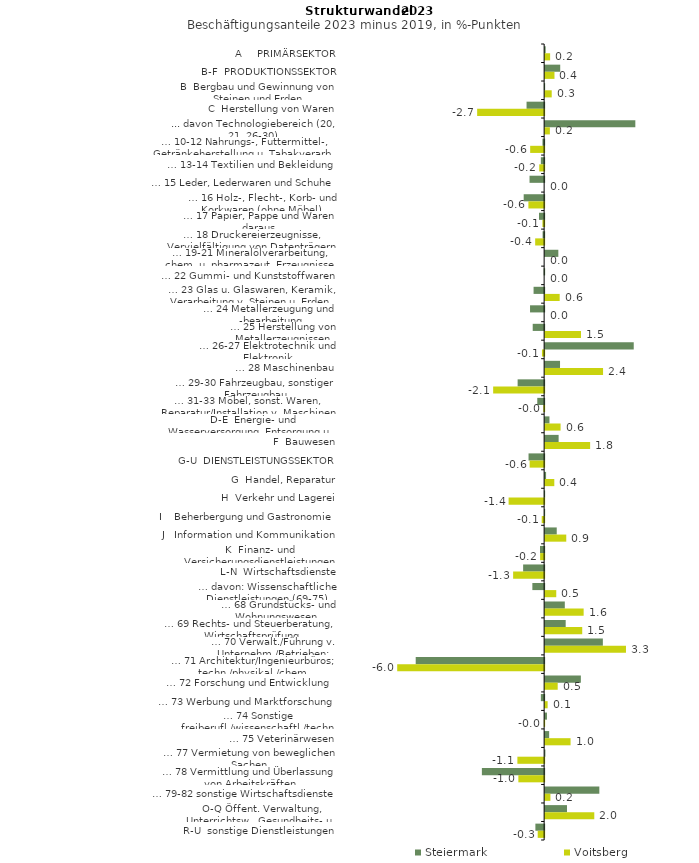
| Category | Steiermark | Voitsberg |
|---|---|---|
| A     PRIMÄRSEKTOR | 0.022 | 0.202 |
| B-F  PRODUKTIONSSEKTOR | 0.612 | 0.379 |
| B  Bergbau und Gewinnung von Steinen und Erden | -0.009 | 0.267 |
| C  Herstellung von Waren | -0.714 | -2.718 |
| ... davon Technologiebereich (20, 21, 26-30) | 3.66 | 0.192 |
| … 10-12 Nahrungs-, Futtermittel-, Getränkeherstellung u. Tabakverarb. | -0.068 | -0.567 |
| … 13-14 Textilien und Bekleidung | -0.134 | -0.199 |
| … 15 Leder, Lederwaren und Schuhe | -0.593 | 0 |
| … 16 Holz-, Flecht-, Korb- und Korkwaren (ohne Möbel)  | -0.83 | -0.639 |
| … 17 Papier, Pappe und Waren daraus  | -0.208 | -0.07 |
| … 18 Druckereierzeugnisse, Vervielfältigung von Datenträgern | -0.063 | -0.364 |
| … 19-21 Mineralölverarbeitung, chem. u. pharmazeut. Erzeugnisse | 0.535 | 0 |
| … 22 Gummi- und Kunststoffwaren | -0.02 | 0 |
| … 23 Glas u. Glaswaren, Keramik, Verarbeitung v. Steinen u. Erden  | -0.429 | 0.59 |
| … 24 Metallerzeugung und -bearbeitung | -0.572 | 0 |
| … 25 Herstellung von Metallerzeugnissen  | -0.464 | 1.455 |
| … 26-27 Elektrotechnik und Elektronik | 3.595 | -0.089 |
| … 28 Maschinenbau | 0.604 | 2.35 |
| … 29-30 Fahrzeugbau, sonstiger Fahrzeugbau | -1.076 | -2.069 |
| … 31-33 Möbel, sonst. Waren, Reparatur/Installation v. Maschinen | -0.279 | -0.034 |
| D-E  Energie- und Wasserversorgung, Entsorgung u. Rückgewinnung | 0.175 | 0.626 |
| F  Bauwesen | 0.547 | 1.825 |
| G-U  DIENSTLEISTUNGSSEKTOR | -0.633 | -0.588 |
| G  Handel, Reparatur | 0.038 | 0.372 |
| H  Verkehr und Lagerei | -0.011 | -1.442 |
| I    Beherbergung und Gastronomie | -0.007 | -0.098 |
| J   Information und Kommunikation | 0.471 | 0.857 |
| K  Finanz- und Versicherungsdienstleistungen | -0.168 | -0.163 |
| L-N  Wirtschaftsdienste | -0.853 | -1.258 |
| … davon: Wissenschaftliche Dienstleistungen (69-75) | -0.478 | 0.451 |
| … 68 Grundstücks- und Wohnungswesen  | 0.798 | 1.562 |
| … 69 Rechts- und Steuerberatung, Wirtschaftsprüfung | 0.834 | 1.505 |
| … 70 Verwalt./Führung v. Unternehm./Betrieben; Unternehmensberat. | 2.342 | 3.28 |
| … 71 Architektur/Ingenieurbüros; techn./physikal./chem. Untersuchung | -5.212 | -5.963 |
| … 72 Forschung und Entwicklung  | 1.449 | 0.51 |
| … 73 Werbung und Marktforschung | -0.133 | 0.101 |
| … 74 Sonstige freiberufl./wissenschaftl./techn. Tätigkeiten | 0.074 | -0.013 |
| … 75 Veterinärwesen | 0.163 | 1.032 |
| … 77 Vermietung von beweglichen Sachen  | 0.011 | -1.086 |
| … 78 Vermittlung und Überlassung von Arbeitskräften | -2.527 | -1.047 |
| … 79-82 sonstige Wirtschaftsdienste | 2.199 | 0.214 |
| O-Q Öffent. Verwaltung, Unterrichtsw., Gesundheits- u. Sozialwesen | 0.886 | 1.994 |
| R-U  sonstige Dienstleistungen | -0.355 | -0.261 |